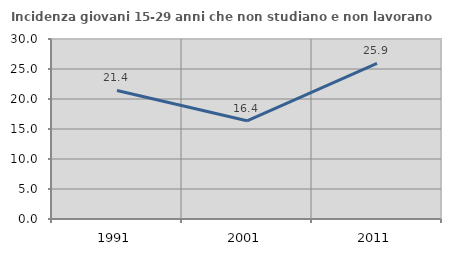
| Category | Incidenza giovani 15-29 anni che non studiano e non lavorano  |
|---|---|
| 1991.0 | 21.429 |
| 2001.0 | 16.364 |
| 2011.0 | 25.926 |